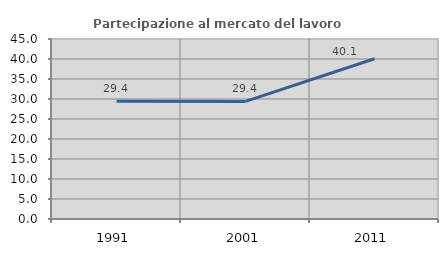
| Category | Partecipazione al mercato del lavoro  femminile |
|---|---|
| 1991.0 | 29.434 |
| 2001.0 | 29.393 |
| 2011.0 | 40.065 |